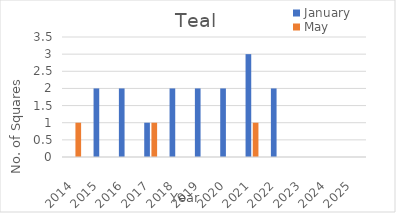
| Category | January | May |
|---|---|---|
| 2014.0 | 0 | 1 |
| 2015.0 | 2 | 0 |
| 2016.0 | 2 | 0 |
| 2017.0 | 1 | 1 |
| 2018.0 | 2 | 0 |
| 2019.0 | 2 | 0 |
| 2020.0 | 2 | 0 |
| 2021.0 | 3 | 1 |
| 2022.0 | 2 | 0 |
| 2023.0 | 0 | 0 |
| 2024.0 | 0 | 0 |
| 2025.0 | 0 | 0 |